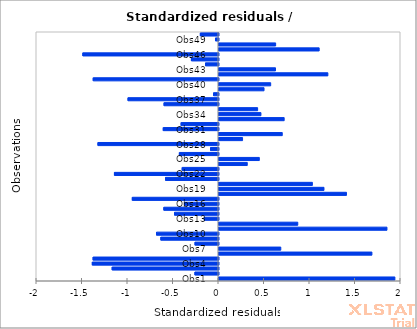
| Category | Series 0 |
|---|---|
| Obs1 | 1.933 |
| Obs2 | -0.259 |
| Obs3 | -1.168 |
| Obs4 | -1.387 |
| Obs5 | -1.378 |
| Obs6 | 1.68 |
| Obs7 | 0.679 |
| Obs8 | -0.258 |
| Obs9 | -0.633 |
| Obs10 | -0.681 |
| Obs11 | 1.846 |
| Obs12 | 0.866 |
| Obs13 | -0.156 |
| Obs14 | -0.483 |
| Obs15 | -0.601 |
| Obs16 | -0.374 |
| Obs17 | -0.947 |
| Obs18 | 1.401 |
| Obs19 | 1.154 |
| Obs20 | 1.026 |
| Obs21 | -0.582 |
| Obs22 | -1.144 |
| Obs23 | -0.399 |
| Obs24 | 0.311 |
| Obs25 | 0.443 |
| Obs26 | -0.43 |
| Obs27 | -0.088 |
| Obs28 | -1.325 |
| Obs29 | 0.259 |
| Obs30 | 0.695 |
| Obs31 | -0.607 |
| Obs32 | -0.411 |
| Obs33 | 0.716 |
| Obs34 | 0.461 |
| Obs35 | 0.424 |
| Obs36 | -0.598 |
| Obs37 | -0.994 |
| Obs38 | -0.054 |
| Obs39 | 0.495 |
| Obs40 | 0.568 |
| Obs41 | -1.377 |
| Obs42 | 1.196 |
| Obs43 | 0.621 |
| Obs44 | -0.143 |
| Obs45 | -0.298 |
| Obs46 | -1.491 |
| Obs47 | 1.101 |
| Obs48 | 0.622 |
| Obs49 | -0.033 |
| Obs50 | -0.199 |